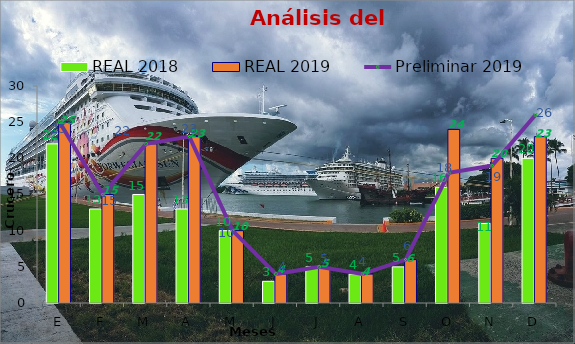
| Category | REAL 2018 | REAL 2019 |
|---|---|---|
| E | 22 | 25 |
| F | 13 | 15 |
| M | 15 | 22 |
| A | 13 | 23 |
| M | 10 | 10 |
| J | 3 | 4 |
| J | 5 | 5 |
| A | 4 | 4 |
| S | 5 | 6 |
| O | 16 | 24 |
| N | 11 | 20 |
| D | 20 | 23 |